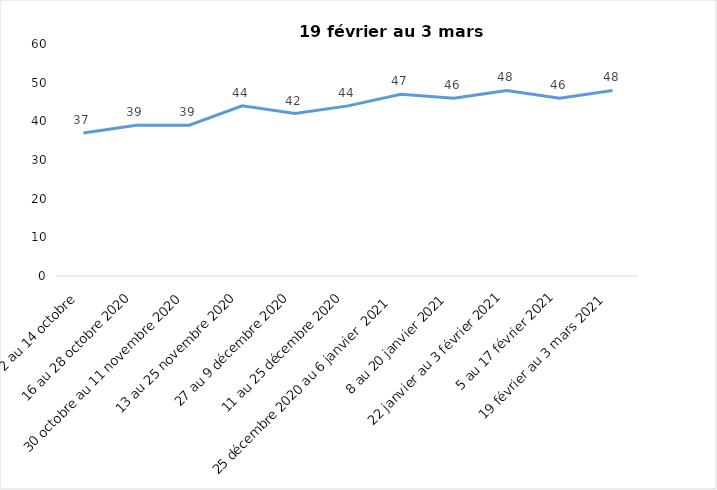
| Category | Toujours aux trois mesures |
|---|---|
| 2 au 14 octobre  | 37 |
| 16 au 28 octobre 2020 | 39 |
| 30 octobre au 11 novembre 2020 | 39 |
| 13 au 25 novembre 2020 | 44 |
| 27 au 9 décembre 2020 | 42 |
| 11 au 25 décembre 2020 | 44 |
| 25 décembre 2020 au 6 janvier  2021 | 47 |
| 8 au 20 janvier 2021 | 46 |
| 22 janvier au 3 février 2021 | 48 |
| 5 au 17 février 2021 | 46 |
| 19 février au 3 mars 2021 | 48 |